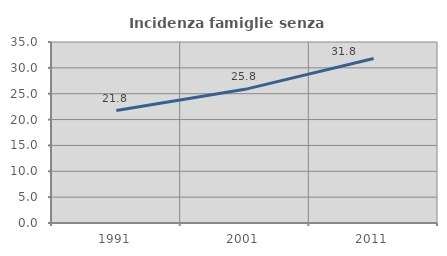
| Category | Incidenza famiglie senza nuclei |
|---|---|
| 1991.0 | 21.752 |
| 2001.0 | 25.845 |
| 2011.0 | 31.814 |